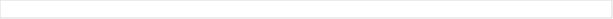
| Category | Series 1 | Series 2 | Series 3 | Series 4 | Series 5 | Series 6 |
|---|---|---|---|---|---|---|
| 0 | 1 | 1 | 1 | 1 | 1 | 1 |